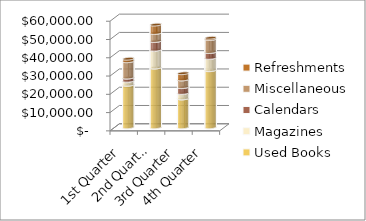
| Category | Used Books | Magazines | Calendars | Miscellaneous | Refreshments |
|---|---|---|---|---|---|
| 1st Quarter | 23273.13 | 2189.43 | 1759.17 | 8942.8 | 1382.01 |
| 2nd Quarter | 32680.09 | 9779.52 | 4755.66 | 4412.9 | 4574 |
| 3rd Quarter | 15787.59 | 3019.34 | 3180.71 | 4212.9 | 3403.6 |
| 4th Quarter | 31254.82 | 6744.06 | 3180.71 | 7102.68 | 720.86 |